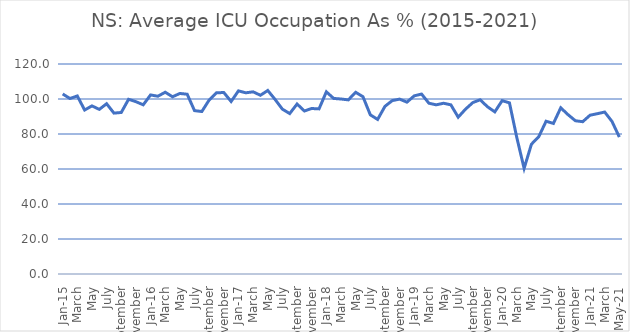
| Category | Column2 |
|---|---|
| Jan-15 | 102.871 |
| February | 100.286 |
| March | 101.742 |
| April | 93.7 |
| May | 96.065 |
| June | 94.067 |
| July | 97.29 |
| August | 91.935 |
| September | 92.3 |
| October | 99.839 |
| November | 98.467 |
| Dec-15 | 96.677 |
| Jan-16 | 102.323 |
| February | 101.586 |
| March | 103.871 |
| April | 101.267 |
| May | 103.161 |
| June | 102.733 |
| July | 93.355 |
| August | 92.839 |
| September | 99.433 |
| October | 103.548 |
| November | 103.7 |
| Dec-16 | 98.581 |
| Jan-17 | 104.645 |
| February | 103.536 |
| March | 104.097 |
| April | 102.133 |
| May | 104.871 |
| June | 99.767 |
| July | 94.194 |
| August | 91.677 |
| September | 97.133 |
| October | 93.161 |
| November | 94.567 |
| Dec-17 | 94.355 |
| Jan-18 | 104.097 |
| February | 100.321 |
| March | 100 |
| April | 99.5 |
| May | 103.839 |
| June | 101.3 |
| July | 90.968 |
| August | 88.323 |
| September | 95.8 |
| October | 99.097 |
| November | 99.933 |
| Dec-18 | 98.194 |
| Jan-19 | 101.806 |
| February | 102.821 |
| March | 97.581 |
| April | 96.667 |
| May | 97.581 |
| June | 96.667 |
| July | 89.613 |
| August | 94.194 |
| September | 97.967 |
| October | 99.548 |
| November | 95.567 |
| Dec-19 | 92.645 |
| Jan-20 | 99.065 |
| February | 97.793 |
| March | 78 |
| April | 60.367 |
| May | 74.161 |
| June | 78.467 |
| July | 87.29 |
| August | 86.032 |
| September | 94.967 |
| October | 91.032 |
| November | 87.567 |
| Dec-20 | 87.032 |
| Jan-21 | 90.742 |
| February | 91.607 |
| March | 92.548 |
| April | 87.167 |
| May-21 | 78.258 |